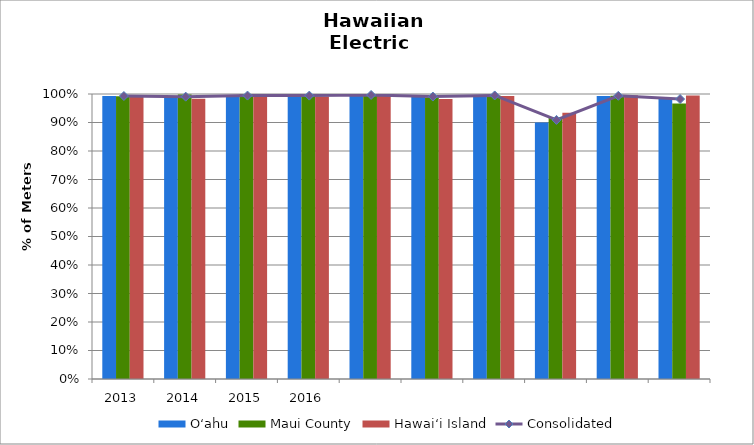
| Category | O‘ahu | Maui County | Hawai‘i Island |
|---|---|---|---|
| 2013.0 | 0.993 | 0.992 | 0.991 |
| 2014.0 | 0.992 | 0.998 | 0.983 |
| 2015.0 | 0.995 | 0.999 | 0.994 |
| 2016.0 | 0.996 | 0.994 | 0.991 |